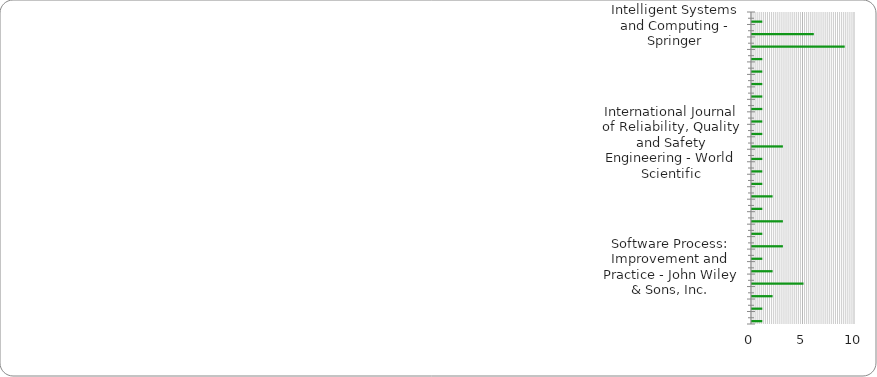
| Category | Series 0 | Series 1 | Series 2 | Number of papers |
|---|---|---|---|---|
| Advances in Intelligent Systems and Computing - Springer |  |  |  | 1 |
| CrossTalk |  |  |  | 6 |
| IEEE Software - IEEE Computer Society |  |  |  | 9 |
| IEEE Transactions on Knowledge and Data Engineering - IEEE Computer Society |  |  |  | 1 |
| IEEE Transactions on Software Engineering - IEEE Computer Society |  |  |  | 1 |
| IET Software - IET Digital Library |  |  |  | 1 |
| Information Technology and Management - Springer |  |  |  | 1 |
| International Arab Journal of Information Technology - Zarqa University |  |  |  | 1 |
| International Journal of Computer Science Issues |  |  |  | 1 |
| International Journal of Information and Communication Technology - Inderscience Publishers |  |  |  | 1 |
| International Journal of Reliability, Quality and Safety Engineering - World Scientific |  |  |  | 3 |
| International Journal of Software Engineering and Its Applications - Science & Engineering Research Support Society |  |  |  | 1 |
| International Journal of Software Engineering and Knowledge Engineering - World Scientific |  |  |  | 1 |
| Journal of Intelligent Manufacturing - Springer |  |  |  | 1 |
| Journal of Software - Academy Publisher |  |  |  | 2 |
| Journal of Software - Chinese Academy of Sciences |  |  |  | 1 |
| Journal of Software: Evolution and Process - John Wiley & Sons, Inc. |  |  |  | 3 |
| Journal of Software Maintenance and Evolution - John Wiley & Sons, Inc. |  |  |  | 1 |
| Journal of Systems and Software - Elsevier |  |  |  | 3 |
| MIS Quarterly |  |  |  | 1 |
| Software Process: Improvement and Practice - John Wiley & Sons, Inc. |  |  |  | 2 |
| Software Quality Journal - Springer |  |  |  | 5 |
| The TQM Magazine - Emerald Insight |  |  |  | 2 |
| Wireless Personal Communications - Springer |  |  |  | 1 |
| WSEAS Transactions on Information Science and Applications - WSEAS Press |  |  |  | 1 |